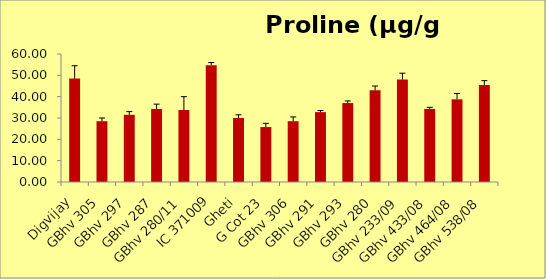
| Category | Proline (µg/g F.W.) |
|---|---|
| Digvijay | 48.5 |
| GBhv 305 | 28.5 |
| GBhv 297 | 31.5 |
| GBhv 287 | 34.25 |
| GBhv 280/11 | 33.75 |
| IC 371009 | 54.75 |
| Gheti | 30 |
| G Cot 23 | 25.75 |
| GBhv 306 | 28.5 |
| GBhv 291 | 32.75 |
| GBhv 293 | 37 |
| GBhv 280 | 43 |
| GBhv 233/09 | 48 |
| GBhv 433/08 | 34.25 |
| GBhv 464/08 | 38.75 |
| GBhv 538/08 | 45.5 |